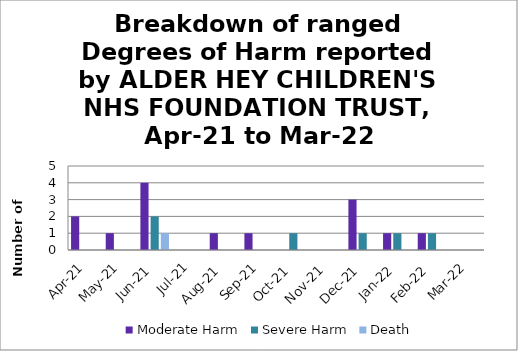
| Category | Moderate Harm | Severe Harm | Death |
|---|---|---|---|
| Apr-21 | 2 | 0 | 0 |
| May-21 | 1 | 0 | 0 |
| Jun-21 | 4 | 2 | 1 |
| Jul-21 | 0 | 0 | 0 |
| Aug-21 | 1 | 0 | 0 |
| Sep-21 | 1 | 0 | 0 |
| Oct-21 | 0 | 1 | 0 |
| Nov-21 | 0 | 0 | 0 |
| Dec-21 | 3 | 1 | 0 |
| Jan-22 | 1 | 1 | 0 |
| Feb-22 | 1 | 1 | 0 |
| Mar-22 | 0 | 0 | 0 |